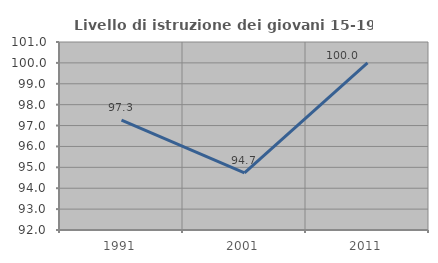
| Category | Livello di istruzione dei giovani 15-19 anni |
|---|---|
| 1991.0 | 97.26 |
| 2001.0 | 94.737 |
| 2011.0 | 100 |